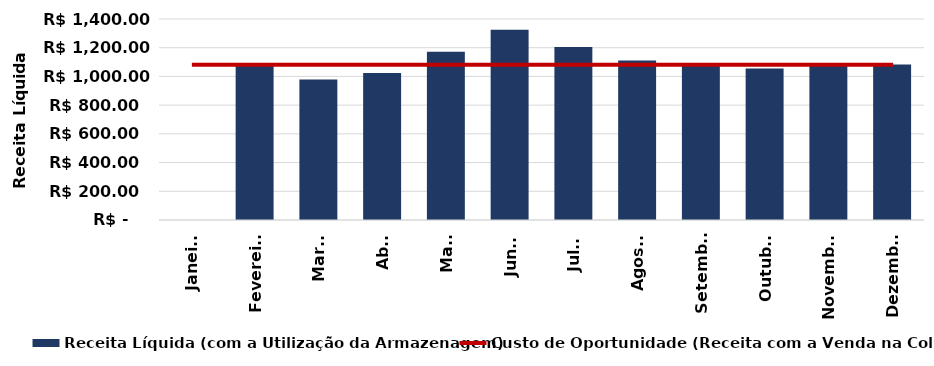
| Category | Receita Líquida (com a Utilização da Armazenagem) |
|---|---|
| Janeiro | 0 |
| Fevereiro | 1081.108 |
| Março | 979.059 |
| Abril | 1023.071 |
| Maio | 1171.22 |
| Junho | 1325.331 |
| Julho | 1204.241 |
| Agosto | 1111.207 |
| Setembro | 1092.387 |
| Outubro | 1055.375 |
| Novembro | 1086.261 |
| Dezembro | 1083.307 |